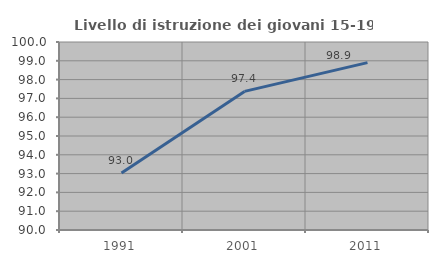
| Category | Livello di istruzione dei giovani 15-19 anni |
|---|---|
| 1991.0 | 93.035 |
| 2001.0 | 97.373 |
| 2011.0 | 98.905 |